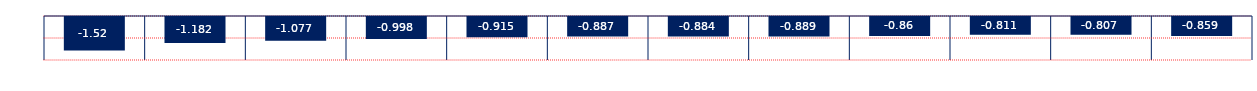
| Category | Spread |
|---|---|
| Mar 24 | -1.52 |
| Apr 24 | -1.182 |
| May 24 | -1.077 |
| Jun 24 | -0.998 |
| Jul 24 | -0.915 |
| Aug 24 | -0.887 |
| Sep 24 | -0.884 |
| Oct 24 | -0.889 |
| Nov 24 | -0.86 |
| Dec 24 | -0.811 |
| Jan 25 | -0.807 |
| Feb 25 | -0.859 |